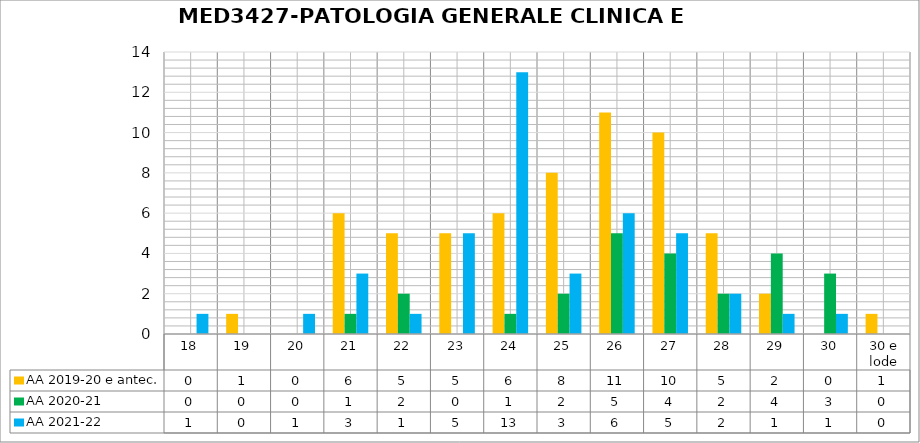
| Category | AA 2019-20 e antec. | AA 2020-21 | AA 2021-22 |
|---|---|---|---|
| 18 | 0 | 0 | 1 |
| 19 | 1 | 0 | 0 |
| 20 | 0 | 0 | 1 |
| 21 | 6 | 1 | 3 |
| 22 | 5 | 2 | 1 |
| 23 | 5 | 0 | 5 |
| 24 | 6 | 1 | 13 |
| 25 | 8 | 2 | 3 |
| 26 | 11 | 5 | 6 |
| 27 | 10 | 4 | 5 |
| 28 | 5 | 2 | 2 |
| 29 | 2 | 4 | 1 |
| 30 | 0 | 3 | 1 |
| 30 e lode | 1 | 0 | 0 |